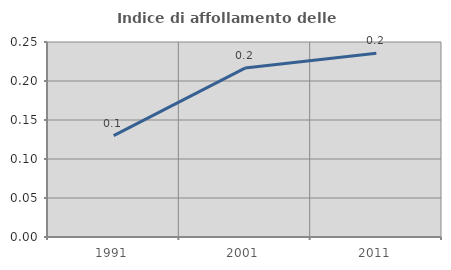
| Category | Indice di affollamento delle abitazioni  |
|---|---|
| 1991.0 | 0.13 |
| 2001.0 | 0.217 |
| 2011.0 | 0.236 |